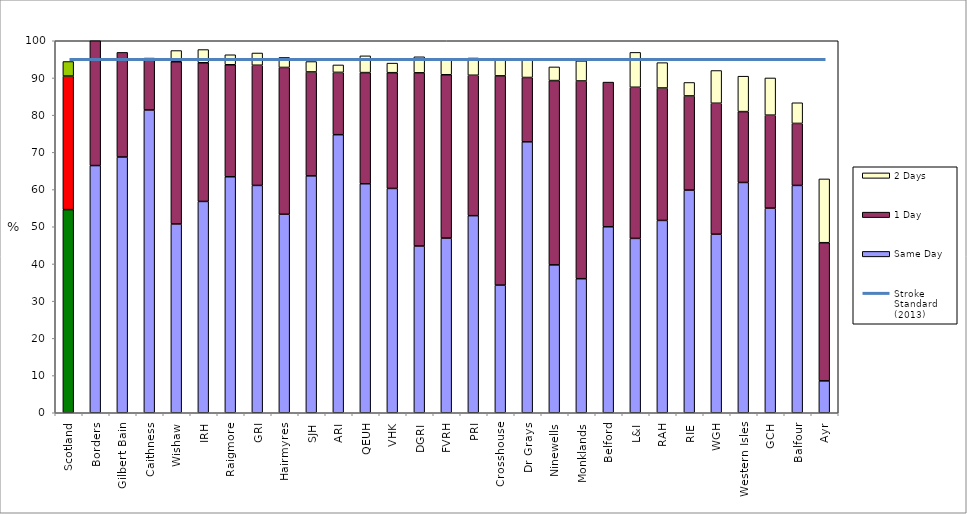
| Category | Same Day | 1 Day | 2 Days |
|---|---|---|---|
| Scotland | 54.61 | 35.898 | 3.911 |
| Borders | 66.452 | 33.548 | 0 |
| Gilbert Bain | 68.75 | 28.125 | 0 |
| Caithness | 81.395 | 13.953 | 0 |
| Wishaw | 50.752 | 43.609 | 3.008 |
| IRH | 56.805 | 37.278 | 3.55 |
| Raigmore | 63.441 | 30.108 | 2.688 |
| GRI | 61.111 | 32.305 | 3.292 |
| Hairmyres | 53.363 | 39.462 | 2.691 |
| SJH | 63.687 | 27.933 | 2.793 |
| ARI | 74.75 | 16.75 | 2 |
| QEUH | 61.562 | 29.88 | 4.505 |
| VHK | 60.3 | 31.116 | 2.575 |
| DGRI | 44.828 | 46.552 | 4.31 |
| FVRH | 46.954 | 43.909 | 4.061 |
| PRI | 52.98 | 37.748 | 4.636 |
| Crosshouse | 34.305 | 56.261 | 4.631 |
| Dr Grays | 72.84 | 17.284 | 4.938 |
| Ninewells | 39.755 | 49.541 | 3.67 |
| Monklands | 36.036 | 53.153 | 5.405 |
| Belford | 50 | 38.889 | 0 |
| L&I | 46.875 | 40.625 | 9.375 |
| RAH | 51.703 | 35.604 | 6.811 |
| RIE | 59.855 | 25.316 | 3.617 |
| WGH | 48 | 35.2 | 8.8 |
| Western Isles | 61.905 | 19.048 | 9.524 |
| GCH | 55 | 25 | 10 |
| Balfour | 61.111 | 16.667 | 5.556 |
| Ayr | 8.571 | 37.143 | 17.143 |